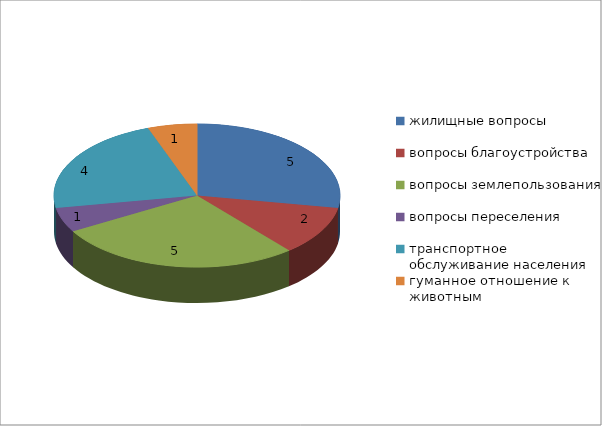
| Category | Series 0 |
|---|---|
| жилищные вопросы | 5 |
| вопросы благоустройства | 2 |
| вопросы землепользования | 5 |
| вопросы переселения | 1 |
| транспортное обслуживание населения | 4 |
| гуманное отношение к животным | 1 |